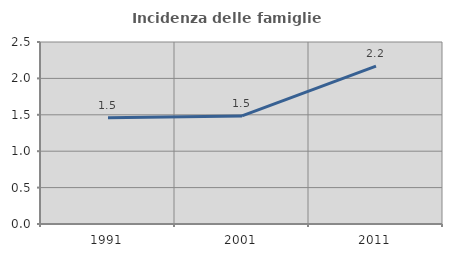
| Category | Incidenza delle famiglie numerose |
|---|---|
| 1991.0 | 1.459 |
| 2001.0 | 1.484 |
| 2011.0 | 2.167 |